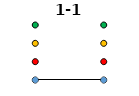
| Category | 0 | 1 | 2 | 3 | 1-1 |
|---|---|---|---|---|---|
| Time 1 | 0 | 1 | 2 | 3 | 0 |
| Time 2 | 0 | 1 | 2 | 3 | 0 |